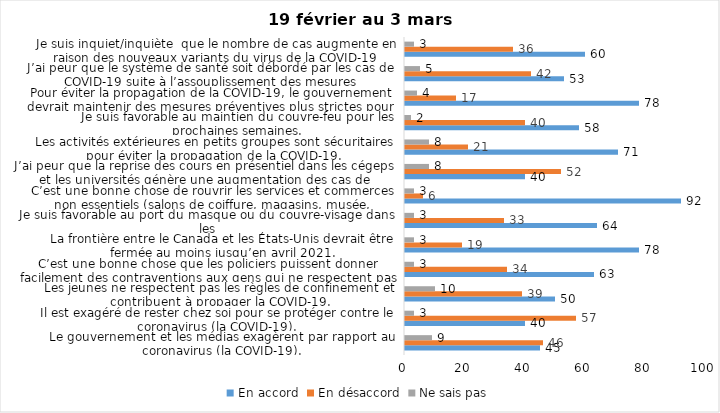
| Category | En accord | En désaccord | Ne sais pas |
|---|---|---|---|
| Le gouvernement et les médias exagèrent par rapport au coronavirus (la COVID-19). | 45 | 46 | 9 |
| Il est exagéré de rester chez soi pour se protéger contre le coronavirus (la COVID-19). | 40 | 57 | 3 |
| Les jeunes ne respectent pas les règles de confinement et contribuent à propager la COVID-19. | 50 | 39 | 10 |
| C’est une bonne chose que les policiers puissent donner facilement des contraventions aux gens qui ne respectent pas les mesures pour prévenir le coronavirus (la COVID-19). | 63 | 34 | 3 |
| La frontière entre le Canada et les États-Unis devrait être fermée au moins jusqu’en avril 2021. | 78 | 19 | 3 |
| Je suis favorable au port du masque ou du couvre-visage dans les
lieux publics extérieurs achalandés (ex. rues, parcs) | 64 | 33 | 3 |
| C’est une bonne chose de rouvrir les services et commerces non essentiels (salons de coiffure, magasins, musée, industries) à partir du 8 février 2021. | 92 | 6 | 3 |
| J’ai peur que la reprise des cours en présentiel dans les cégeps et les universités génère une augmentation des cas de COVID-19. | 40 | 52 | 8 |
| Les activités extérieures en petits groupes sont sécuritaires pour éviter la propagation de la COVID-19. | 71 | 21 | 8 |
| Je suis favorable au maintien du couvre-feu pour les prochaines semaines. | 58 | 40 | 2 |
| Pour éviter la propagation de la COVID-19, le gouvernement devrait maintenir des mesures préventives plus strictes pour la grande région de Montréal. | 78 | 17 | 4 |
| J’ai peur que le système de santé soit débordé par les cas de COVID-19 suite à l’assouplissement des mesures | 53 | 42 | 5 |
| Je suis inquiet/inquiète  que le nombre de cas augmente en raison des nouveaux variants du virus de la COVID-19 | 60 | 36 | 3 |